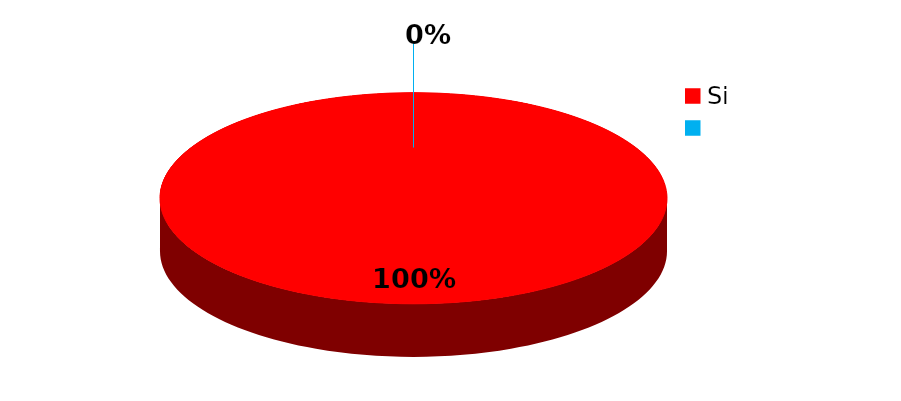
| Category | Series 0 |
|---|---|
| Si | 11 |